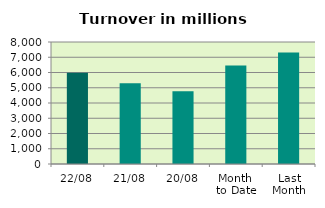
| Category | Series 0 |
|---|---|
| 22/08 | 5990.324 |
| 21/08 | 5292.226 |
| 20/08 | 4773.526 |
| Month 
to Date | 6458.64 |
| Last
Month | 7313.522 |